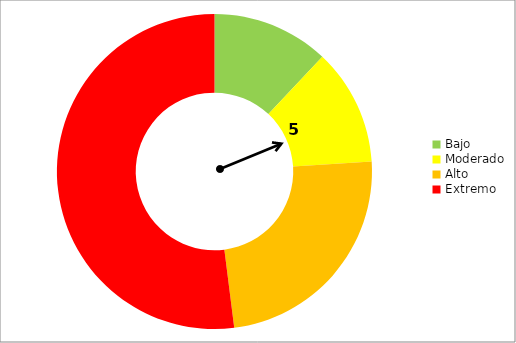
| Category | Series 0 |
|---|---|
| Bajo | 12 |
| Moderado | 12 |
| Alto | 24 |
| Extremo | 52 |